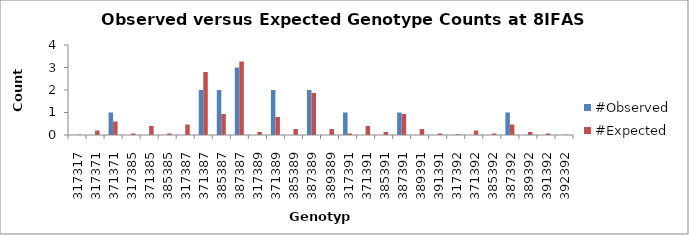
| Category | #Observed | #Expected |
|---|---|---|
| 317317.0 | 0 | 0.017 |
| 317371.0 | 0 | 0.2 |
| 371371.0 | 1 | 0.6 |
| 317385.0 | 0 | 0.067 |
| 371385.0 | 0 | 0.4 |
| 385385.0 | 0 | 0.067 |
| 317387.0 | 0 | 0.467 |
| 371387.0 | 2 | 2.8 |
| 385387.0 | 2 | 0.933 |
| 387387.0 | 3 | 3.267 |
| 317389.0 | 0 | 0.133 |
| 371389.0 | 2 | 0.8 |
| 385389.0 | 0 | 0.267 |
| 387389.0 | 2 | 1.867 |
| 389389.0 | 0 | 0.267 |
| 317391.0 | 1 | 0.067 |
| 371391.0 | 0 | 0.4 |
| 385391.0 | 0 | 0.133 |
| 387391.0 | 1 | 0.933 |
| 389391.0 | 0 | 0.267 |
| 391391.0 | 0 | 0.067 |
| 317392.0 | 0 | 0.033 |
| 371392.0 | 0 | 0.2 |
| 385392.0 | 0 | 0.067 |
| 387392.0 | 1 | 0.467 |
| 389392.0 | 0 | 0.133 |
| 391392.0 | 0 | 0.067 |
| 392392.0 | 0 | 0.017 |